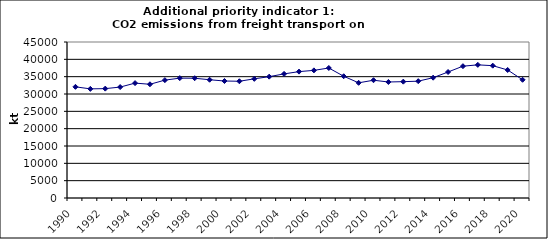
| Category | CO2 emissions from freight transport on road, kt  |
|---|---|
| 1990 | 32064.439 |
| 1991 | 31478.613 |
| 1992 | 31548.139 |
| 1993 | 32000.138 |
| 1994 | 33137.11 |
| 1995 | 32804.253 |
| 1996 | 33998.251 |
| 1997 | 34575.159 |
| 1998 | 34552.1 |
| 1999 | 34110.613 |
| 2000 | 33746.573 |
| 2001 | 33676.803 |
| 2002 | 34374.645 |
| 2003 | 34998.599 |
| 2004 | 35805.099 |
| 2005 | 36457.525 |
| 2006 | 36815.32 |
| 2007 | 37500.754 |
| 2008 | 35121.504 |
| 2009 | 33223.912 |
| 2010 | 33974.676 |
| 2011 | 33462.244 |
| 2012 | 33556.805 |
| 2013 | 33697.48 |
| 2014 | 34709.517 |
| 2015 | 36342.024 |
| 2016 | 38025.254 |
| 2017 | 38408.695 |
| 2018 | 38169.795 |
| 2019 | 36931.731 |
| 2020 | 34099.417 |